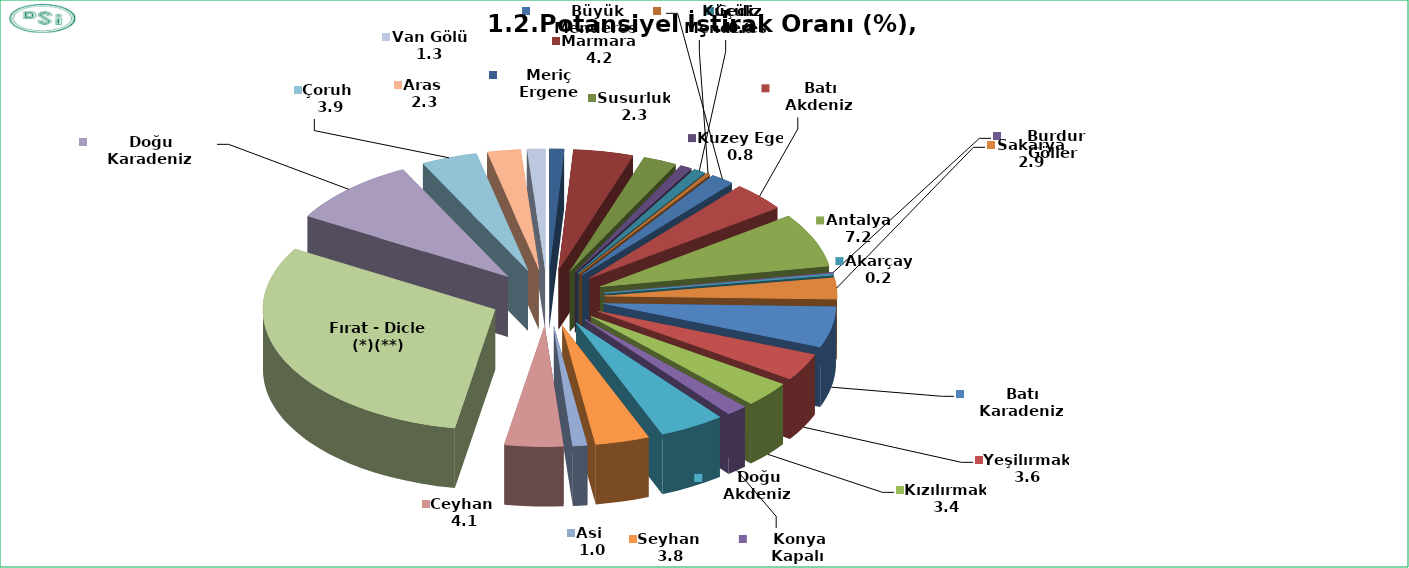
| Category | Potansiyel İştirak Oranı (%) |
|---|---|
| Meriç Ergene | 1.019 |
| Marmara  | 4.171 |
| Susurluk  | 2.338 |
| Kuzey Ege  | 0.83 |
| Gediz  | 0.854 |
| Küçük Menderes  | 0.292 |
| Büyük Menderes  | 1.642 |
| Batı Akdeniz  | 3.855 |
| Antalya  | 7.236 |
| Burdur Göller  | 0.142 |
| Akarçay  | 0.18 |
| Sakarya  | 2.853 |
| Batı Karadeniz  | 5.484 |
| Yeşilırmak  | 3.641 |
| Kızılırmak  | 3.385 |
| Konya Kapalı  | 1.464 |
| Doğu Akdeniz  | 4.558 |
| Seyhan  | 3.753 |
| Asi  | 1.003 |
| Ceyhan  | 4.077 |
| Fırat - Dicle (*)(**) | 30.654 |
| Doğu Karadeniz  | 9.105 |
| Çoruh  | 3.898 |
| Aras  | 2.313 |
| Van Gölü  | 1.252 |